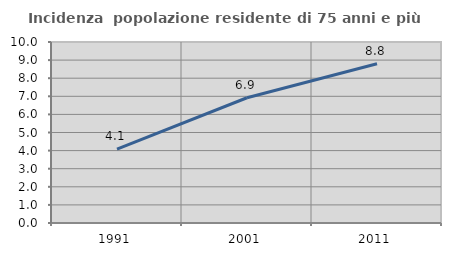
| Category | Incidenza  popolazione residente di 75 anni e più |
|---|---|
| 1991.0 | 4.082 |
| 2001.0 | 6.921 |
| 2011.0 | 8.802 |